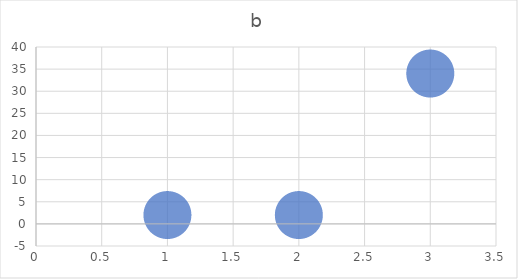
| Category | b |
|---|---|
| 1.0 | 2 |
| 3.0 | 34 |
| 2.0 | 2 |